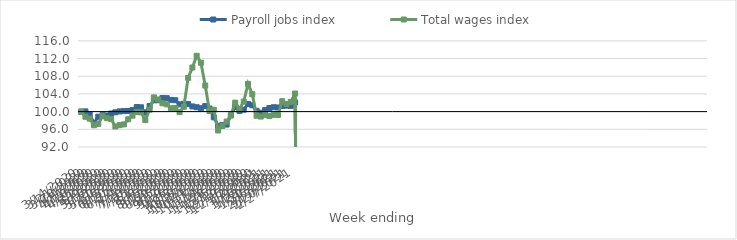
| Category | Payroll jobs index | Total wages index |
|---|---|---|
| 14/03/2020 | 100 | 100 |
| 21/03/2020 | 100.048 | 98.837 |
| 28/03/2020 | 99.422 | 98.406 |
| 04/04/2020 | 97.413 | 96.922 |
| 11/04/2020 | 98.847 | 97.224 |
| 18/04/2020 | 99.192 | 98.963 |
| 25/04/2020 | 99.114 | 98.514 |
| 02/05/2020 | 99.571 | 98.318 |
| 09/05/2020 | 99.843 | 96.628 |
| 16/05/2020 | 100.046 | 96.945 |
| 23/05/2020 | 100.102 | 97.112 |
| 30/05/2020 | 100.142 | 98.267 |
| 06/06/2020 | 100.348 | 99.086 |
| 13/06/2020 | 101.03 | 99.911 |
| 20/06/2020 | 100.974 | 99.838 |
| 27/06/2020 | 99.769 | 98.09 |
| 04/07/2020 | 101.256 | 100.44 |
| 11/07/2020 | 102.559 | 103.219 |
| 18/07/2020 | 102.573 | 102.752 |
| 25/07/2020 | 103.055 | 101.878 |
| 01/08/2020 | 103.043 | 101.649 |
| 08/08/2020 | 102.651 | 100.747 |
| 15/08/2020 | 102.573 | 100.822 |
| 22/08/2020 | 101.638 | 99.889 |
| 29/08/2020 | 101.752 | 101.092 |
| 05/09/2020 | 101.701 | 107.624 |
| 12/09/2020 | 101.172 | 109.967 |
| 19/09/2020 | 100.992 | 112.614 |
| 26/09/2020 | 100.77 | 111.048 |
| 03/10/2020 | 101.251 | 105.893 |
| 10/10/2020 | 100.693 | 100.139 |
| 17/10/2020 | 98.719 | 100.41 |
| 24/10/2020 | 96.786 | 95.737 |
| 31/10/2020 | 96.949 | 96.734 |
| 07/11/2020 | 97.075 | 97.749 |
| 14/11/2020 | 99.179 | 99.117 |
| 21/11/2020 | 101.025 | 102.018 |
| 28/11/2020 | 100.163 | 100.617 |
| 05/12/2020 | 100.433 | 102.261 |
| 12/12/2020 | 101.736 | 106.274 |
| 19/12/2020 | 101.44 | 103.927 |
| 26/12/2020 | 100.186 | 99.07 |
| 02/01/2021 | 99.748 | 98.885 |
| 09/01/2021 | 100.352 | 99.26 |
| 16/01/2021 | 100.807 | 98.994 |
| 23/01/2021 | 100.982 | 99.266 |
| 30/01/2021 | 100.929 | 99.24 |
| 06/02/2021 | 101.271 | 102.362 |
| 13/02/2021 | 101.353 | 101.732 |
| 20/02/2021 | 101.299 | 102.206 |
| 27/02/2021 | 102.08 | 104.09 |